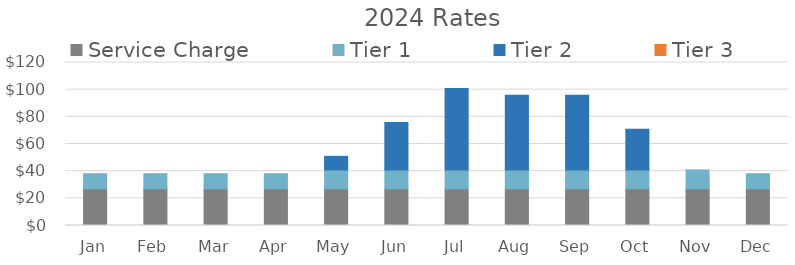
| Category | Service Charge | Tier 1 | Tier 2 | Tier 3 |
|---|---|---|---|---|
| Jan | 27.01 | 11.12 | 0 | 0 |
| Feb | 27.01 | 11.12 | 0 | 0 |
| Mar | 27.01 | 11.12 | 0 | 0 |
| Apr | 27.01 | 11.12 | 0 | 0 |
| May | 27.01 | 13.9 | 10 | 0 |
| Jun | 27.01 | 13.9 | 35 | 0 |
| Jul | 27.01 | 13.9 | 60 | 0 |
| Aug | 27.01 | 13.9 | 55 | 0 |
| Sep | 27.01 | 13.9 | 55 | 0 |
| Oct | 27.01 | 13.9 | 30 | 0 |
| Nov | 27.01 | 13.9 | 0 | 0 |
| Dec | 27.01 | 11.12 | 0 | 0 |